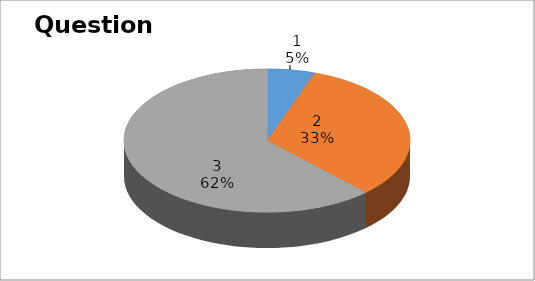
| Category | Series 0 |
|---|---|
| 0 | 2 |
| 1 | 12 |
| 2 | 23 |